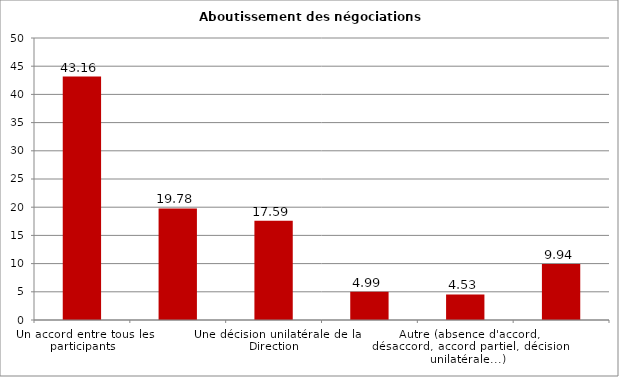
| Category | Aboutissement des négociations salariales |
|---|---|
| Un accord entre tous les participants | 43.16 |
| Un accord entre la Direction et certains participants | 19.78 |
| Une décision unilatérale de la Direction | 17.59 |
| La négociation est toujours en cours | 4.99 |
| Autre (absence d'accord, désaccord, accord partiel, décision unilatérale...) | 4.53 |
| (NSP) | 9.94 |